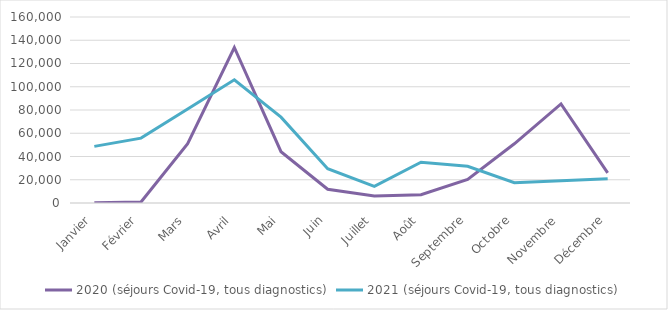
| Category | 2020 (séjours Covid-19, tous diagnostics) | 2021 (séjours Covid-19, tous diagnostics) |
|---|---|---|
| Janvier | 219 | 48704 |
| Février | 815 | 55813 |
| Mars | 51111 | 80877 |
| Avril | 133780 | 105991 |
| Mai | 44143 | 73836 |
| Juin | 11832 | 29540 |
| Juillet | 5992 | 14336 |
| Août | 7106 | 35048 |
| Septembre | 20324 | 31620 |
| Octobre | 50952 | 17520 |
| Novembre | 85278 | 19223 |
| Décembre | 25868 | 20835 |